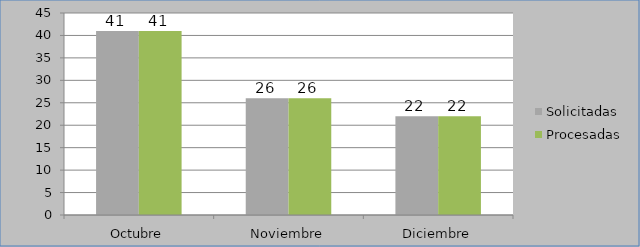
| Category | Solicitadas | Procesadas |
|---|---|---|
| Octubre | 41 | 41 |
| Noviembre | 26 | 26 |
| Diciembre | 22 | 22 |